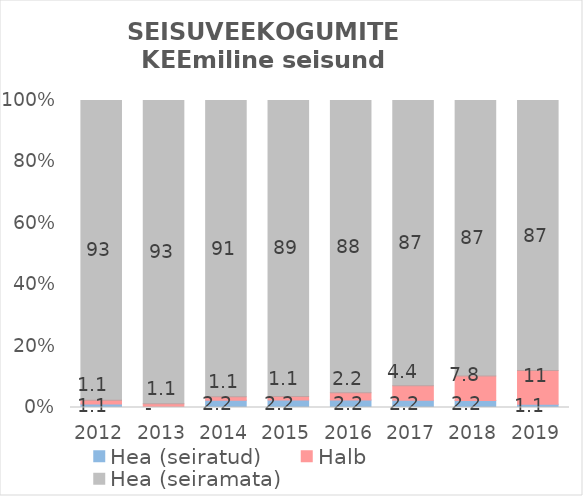
| Category | Hea (seiratud) | Halb | Hea (seiramata) |
|---|---|---|---|
| 2012.0 | 1.111 | 1.111 | 93.478 |
| 2013.0 | 0 | 1.111 | 92.702 |
| 2014.0 | 2.222 | 1.111 | 90.994 |
| 2015.0 | 2.222 | 1.111 | 88.665 |
| 2016.0 | 2.222 | 2.222 | 87.888 |
| 2017.0 | 2.222 | 4.444 | 87.267 |
| 2018.0 | 2.222 | 7.778 | 87.112 |
| 2019.0 | 1.075 | 10.753 | 86.614 |